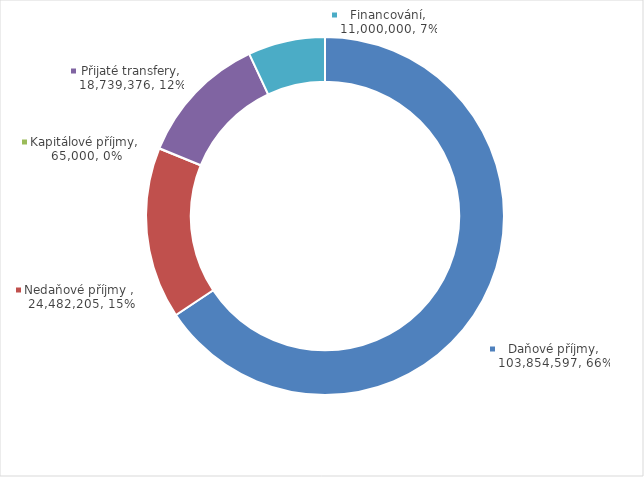
| Category | Series 0 |
|---|---|
| Daňové příjmy | 103854597 |
| Nedaňové příjmy  | 24482205 |
| Kapitálové příjmy | 65000 |
| Přijaté transfery | 18739376 |
| Financování | 11000000 |